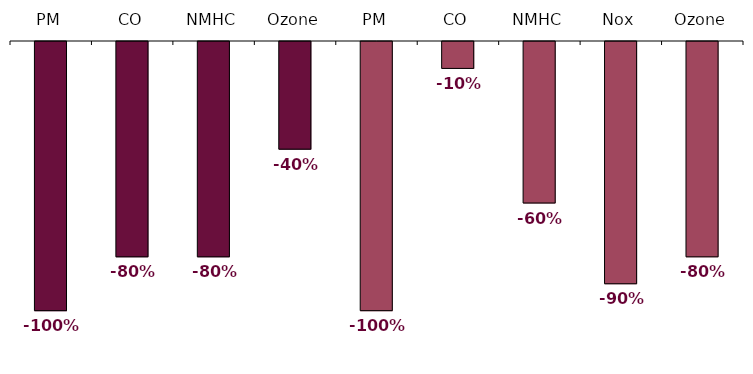
| Category | Series 0 |
|---|---|
| PM | -1 |
| CO | -0.8 |
| NMHC | -0.8 |
| Ozone | -0.4 |
| PM | -1 |
| CO | -0.1 |
| NMHC | -0.6 |
| Nox | -0.9 |
| Ozone | -0.8 |